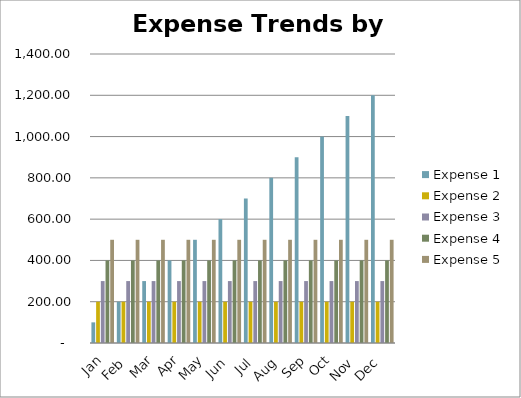
| Category | Expense 1 | Expense 2 | Expense 3 | Expense 4 | Expense 5 |
|---|---|---|---|---|---|
| Jan | 100 | 200 | 300 | 400 | 500 |
| Feb | 200 | 200 | 300 | 400 | 500 |
| Mar | 300 | 200 | 300 | 400 | 500 |
| Apr | 400 | 200 | 300 | 400 | 500 |
| May | 500 | 200 | 300 | 400 | 500 |
| Jun | 600 | 200 | 300 | 400 | 500 |
| Jul | 700 | 200 | 300 | 400 | 500 |
| Aug | 800 | 200 | 300 | 400 | 500 |
| Sep | 900 | 200 | 300 | 400 | 500 |
| Oct | 1000 | 200 | 300 | 400 | 500 |
| Nov | 1100 | 200 | 300 | 400 | 500 |
| Dec | 1200 | 200 | 300 | 400 | 500 |